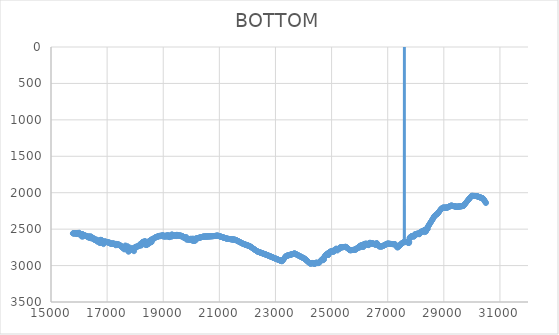
| Category | BOTTOM |
|---|---|
| 15780.464 | 2557.96 |
| 15787.5977 | 2557.96 |
| 15797.8371 | 2557.96 |
| 15808.0771 | 2557.96 |
| 15818.3171 | 2557.96 |
| 15828.5571 | 2557.96 |
| 15838.7971 | 2557.96 |
| 15849.0371 | 2557.96 |
| 15859.2771 | 2557.96 |
| 15869.5171 | 2557.96 |
| 15879.7571 | 2557.96 |
| 15889.9971 | 2557.96 |
| 15900.2371 | 2557.96 |
| 15910.477 | 2557.96 |
| 15920.717 | 2567.81 |
| 15930.957 | 2563.59 |
| 15941.197 | 2555.14 |
| 15951.437 | 2552.32 |
| 15961.677 | 2552.32 |
| 15971.917 | 2566.4 |
| 15982.157 | 2567.81 |
| 15992.397 | 2567.81 |
| 16002.637 | 2549.51 |
| 16012.877 | 2569.22 |
| 16023.117 | 2560.77 |
| 16033.357 | 2563.59 |
| 16043.597 | 2563.59 |
| 16053.8369 | 2566.4 |
| 16064.0769 | 2566.4 |
| 16074.3169 | 2567.81 |
| 16084.5569 | 2598.78 |
| 16094.7969 | 2566.4 |
| 16105.0369 | 2567.81 |
| 16115.2769 | 2567.81 |
| 16125.5169 | 2604.41 |
| 16135.7569 | 2573.44 |
| 16145.9969 | 2581.88 |
| 16156.2369 | 2577.66 |
| 16166.4769 | 2579.07 |
| 16176.7169 | 2591.74 |
| 16186.9569 | 2593.15 |
| 16197.1968 | 2583.29 |
| 16207.4368 | 2587.52 |
| 16217.6768 | 2587.52 |
| 16227.9168 | 2594.55 |
| 16238.1568 | 2590.33 |
| 16248.3968 | 2593.15 |
| 16258.6368 | 2595.96 |
| 16268.8768 | 2595.96 |
| 16279.1168 | 2595.96 |
| 16289.3568 | 2601.59 |
| 16299.5968 | 2601.59 |
| 16309.8368 | 2605.81 |
| 16320.0768 | 2608.63 |
| 16330.3168 | 2597.37 |
| 16340.5567 | 2614.26 |
| 16350.7967 | 2615.67 |
| 16361.0367 | 2618.48 |
| 16371.2767 | 2601.59 |
| 16381.5167 | 2603 |
| 16391.7567 | 2604.41 |
| 16401.9967 | 2601.59 |
| 16412.2367 | 2624.11 |
| 16422.4767 | 2603 |
| 16432.7167 | 2624.11 |
| 16442.9567 | 2605.81 |
| 16453.1967 | 2612.85 |
| 16463.4367 | 2629.74 |
| 16473.6766 | 2617.08 |
| 16483.9166 | 2619.89 |
| 16494.1566 | 2621.3 |
| 16504.3966 | 2622.71 |
| 16514.6366 | 2636.78 |
| 16524.8766 | 2639.6 |
| 16535.1166 | 2641 |
| 16545.3566 | 2645.23 |
| 16555.5966 | 2632.56 |
| 16565.8366 | 2646.63 |
| 16576.0766 | 2638.19 |
| 16586.3166 | 2652.27 |
| 16596.5566 | 2652.27 |
| 16606.7966 | 2649.45 |
| 16617.0365 | 2650.86 |
| 16627.2765 | 2643.82 |
| 16637.5165 | 2657.9 |
| 16647.7565 | 2667.75 |
| 16657.9965 | 2671.97 |
| 16668.2365 | 2656.49 |
| 16678.4765 | 2656.49 |
| 16688.7165 | 2656.49 |
| 16698.9565 | 2666.34 |
| 16709.1965 | 2667.75 |
| 16719.4365 | 2666.34 |
| 16729.6765 | 2666.34 |
| 16739.9165 | 2690.27 |
| 16750.1564 | 2690.27 |
| 16760.3964 | 2646.63 |
| 16770.6364 | 2648.04 |
| 16780.8764 | 2648.04 |
| 16791.1164 | 2652.27 |
| 16801.3564 | 2648.04 |
| 16811.5964 | 2673.38 |
| 16821.8364 | 2684.64 |
| 16832.0764 | 2673.38 |
| 16842.3164 | 2680.42 |
| 16852.5564 | 2687.46 |
| 16862.7964 | 2673.38 |
| 16873.0364 | 2705.75 |
| 16883.2764 | 2687.46 |
| 16893.5163 | 2670.56 |
| 16903.7563 | 2670.56 |
| 16913.9963 | 2667.75 |
| 16924.2363 | 2670.56 |
| 16934.4763 | 2674.79 |
| 16944.7163 | 2673.38 |
| 16954.9563 | 2676.19 |
| 16965.1963 | 2670.56 |
| 16975.4363 | 2676.19 |
| 16985.6763 | 2676.19 |
| 16995.9163 | 2677.6 |
| 17006.1563 | 2680.42 |
| 17016.3963 | 2679.01 |
| 17026.6362 | 2681.83 |
| 17036.8762 | 2681.83 |
| 17047.1162 | 2683.23 |
| 17057.3562 | 2684.64 |
| 17067.5962 | 2687.46 |
| 17077.8362 | 2686.05 |
| 17088.0762 | 2684.64 |
| 17098.3162 | 2688.86 |
| 17108.5562 | 2697.31 |
| 17118.7962 | 2697.31 |
| 17129.0362 | 2697.31 |
| 17139.2762 | 2697.31 |
| 17149.5162 | 2698.72 |
| 17159.7561 | 2700.12 |
| 17169.9961 | 2700.12 |
| 17180.2361 | 2701.53 |
| 17190.4761 | 2695.9 |
| 17200.7161 | 2697.31 |
| 17210.9561 | 2698.72 |
| 17221.1961 | 2700.12 |
| 17231.4361 | 2695.9 |
| 17241.6761 | 2701.53 |
| 17251.9161 | 2700.12 |
| 17262.1561 | 2705.75 |
| 17272.3961 | 2708.57 |
| 17282.6361 | 2702.94 |
| 17292.876 | 2704.35 |
| 17303.116 | 2721.24 |
| 17313.356 | 2701.53 |
| 17323.596 | 2709.98 |
| 17333.836 | 2707.16 |
| 17344.076 | 2714.2 |
| 17354.316 | 2707.16 |
| 17364.556 | 2718.42 |
| 17374.796 | 2708.57 |
| 17385.036 | 2709.98 |
| 17395.276 | 2709.98 |
| 17405.516 | 2709.98 |
| 17415.756 | 2714.2 |
| 17425.9959 | 2714.2 |
| 17436.2359 | 2718.42 |
| 17446.4759 | 2722.65 |
| 17456.7159 | 2722.65 |
| 17466.9559 | 2725.46 |
| 17477.1959 | 2728.28 |
| 17487.4359 | 2724.05 |
| 17497.6759 | 2736.72 |
| 17507.9159 | 2736.72 |
| 17518.1559 | 2742.35 |
| 17528.3959 | 2742.35 |
| 17538.6359 | 2749.39 |
| 17548.8758 | 2753.61 |
| 17559.1158 | 2753.61 |
| 17569.3558 | 2759.24 |
| 17579.5958 | 2759.24 |
| 17589.8358 | 2760.65 |
| 17600.0758 | 2769.1 |
| 17610.3158 | 2777.54 |
| 17620.5558 | 2739.54 |
| 17630.7958 | 2773.32 |
| 17641.0358 | 2747.98 |
| 17651.2758 | 2724.05 |
| 17661.5158 | 2739.54 |
| 17671.7558 | 2752.21 |
| 17681.9957 | 2753.61 |
| 17692.2357 | 2755.02 |
| 17702.4757 | 2756.43 |
| 17712.7157 | 2757.84 |
| 17722.9557 | 2736.72 |
| 17733.1957 | 2736.72 |
| 17743.4357 | 2759.24 |
| 17753.6757 | 2807.1 |
| 17763.9157 | 2805.7 |
| 17774.1557 | 2804.29 |
| 17784.3957 | 2766.28 |
| 17794.6357 | 2767.69 |
| 17804.8757 | 2794.43 |
| 17815.1156 | 2773.32 |
| 17825.3556 | 2753.61 |
| 17835.5956 | 2785.99 |
| 17845.8356 | 2784.58 |
| 17856.0756 | 2774.73 |
| 17866.3156 | 2776.14 |
| 17876.5556 | 2773.32 |
| 17886.7956 | 2777.54 |
| 17897.0356 | 2777.54 |
| 17907.2756 | 2770.51 |
| 17917.5156 | 2769.1 |
| 17927.7556 | 2759.24 |
| 17937.9955 | 2790.21 |
| 17948.2355 | 2764.87 |
| 17958.4755 | 2802.88 |
| 17968.7155 | 2762.06 |
| 17978.9555 | 2756.43 |
| 17989.1955 | 2750.8 |
| 17999.4355 | 2746.58 |
| 18009.6755 | 2742.35 |
| 18019.9155 | 2743.76 |
| 18030.1555 | 2742.35 |
| 18040.3955 | 2750.8 |
| 18050.6355 | 2745.17 |
| 18060.8754 | 2740.95 |
| 18071.1154 | 2738.13 |
| 18081.3554 | 2736.72 |
| 18091.5954 | 2735.31 |
| 18101.8354 | 2735.31 |
| 18112.0754 | 2732.5 |
| 18122.3154 | 2731.09 |
| 18132.5554 | 2731.09 |
| 18142.7954 | 2728.28 |
| 18153.0354 | 2728.28 |
| 18163.2754 | 2709.98 |
| 18173.5154 | 2708.57 |
| 18183.7553 | 2707.16 |
| 18193.9953 | 2704.35 |
| 18204.2353 | 2702.94 |
| 18214.4753 | 2722.65 |
| 18224.7153 | 2722.65 |
| 18234.9553 | 2697.31 |
| 18245.1953 | 2694.49 |
| 18255.4353 | 2694.49 |
| 18265.6753 | 2674.79 |
| 18275.9153 | 2674.79 |
| 18286.1553 | 2687.46 |
| 18296.3953 | 2686.05 |
| 18306.6353 | 2684.64 |
| 18316.8752 | 2673.38 |
| 18327.1152 | 2667.75 |
| 18337.3552 | 2667.75 |
| 18347.5952 | 2670.56 |
| 18357.8352 | 2666.34 |
| 18368.0752 | 2671.97 |
| 18378.3152 | 2718.42 |
| 18388.5552 | 2715.61 |
| 18398.7952 | 2715.61 |
| 18409.0352 | 2712.79 |
| 18419.2752 | 2712.79 |
| 18429.5152 | 2711.39 |
| 18439.7551 | 2707.16 |
| 18449.9951 | 2707.16 |
| 18460.2351 | 2671.97 |
| 18470.4751 | 2704.35 |
| 18480.7151 | 2676.19 |
| 18490.9551 | 2666.34 |
| 18501.1951 | 2686.05 |
| 18511.4351 | 2662.12 |
| 18521.6751 | 2680.42 |
| 18531.9151 | 2681.83 |
| 18542.1551 | 2652.27 |
| 18552.3951 | 2667.75 |
| 18562.635 | 2645.23 |
| 18572.875 | 2679.01 |
| 18583.115 | 2679.01 |
| 18593.355 | 2641 |
| 18603.595 | 2636.78 |
| 18613.835 | 2648.04 |
| 18624.075 | 2645.23 |
| 18634.315 | 2645.23 |
| 18644.555 | 2631.15 |
| 18654.795 | 2628.34 |
| 18665.035 | 2629.74 |
| 18675.2749 | 2625.52 |
| 18685.5149 | 2625.52 |
| 18695.7549 | 2619.89 |
| 18705.9949 | 2615.67 |
| 18716.2349 | 2615.67 |
| 18726.4749 | 2612.85 |
| 18736.7149 | 2611.44 |
| 18746.9549 | 2610.04 |
| 18757.1949 | 2608.63 |
| 18767.4349 | 2607.22 |
| 18777.6749 | 2604.41 |
| 18787.9149 | 2604.41 |
| 18798.1548 | 2600.18 |
| 18808.3948 | 2601.59 |
| 18818.6348 | 2598.78 |
| 18828.8748 | 2598.78 |
| 18839.1148 | 2597.37 |
| 18849.3548 | 2595.96 |
| 18859.5948 | 2591.74 |
| 18869.8348 | 2595.96 |
| 18880.0748 | 2591.74 |
| 18890.3148 | 2597.37 |
| 18900.5548 | 2591.74 |
| 18910.7948 | 2591.74 |
| 18921.0347 | 2590.33 |
| 18931.2747 | 2590.33 |
| 18941.5147 | 2591.74 |
| 18951.7547 | 2590.33 |
| 18961.9947 | 2591.74 |
| 18972.2347 | 2584.7 |
| 18982.4747 | 2584.7 |
| 18992.7147 | 2586.11 |
| 19002.9547 | 2603 |
| 19013.1947 | 2586.11 |
| 19023.4347 | 2600.18 |
| 19033.6746 | 2595.96 |
| 19043.9146 | 2593.15 |
| 19054.1546 | 2598.78 |
| 19064.3946 | 2598.78 |
| 19074.6346 | 2598.78 |
| 19084.8746 | 2603 |
| 19095.1146 | 2588.92 |
| 19105.3546 | 2588.92 |
| 19115.5946 | 2597.37 |
| 19125.8346 | 2587.52 |
| 19136.0746 | 2586.11 |
| 19146.3146 | 2600.18 |
| 19156.5545 | 2601.59 |
| 19166.7945 | 2584.7 |
| 19177.0345 | 2581.88 |
| 19187.2745 | 2593.15 |
| 19197.5145 | 2604.41 |
| 19207.7545 | 2604.41 |
| 19217.9945 | 2604.41 |
| 19228.2345 | 2610.04 |
| 19238.4745 | 2586.11 |
| 19248.7145 | 2597.37 |
| 19258.9545 | 2597.37 |
| 19269.1944 | 2591.74 |
| 19279.4344 | 2590.33 |
| 19289.6744 | 2605.81 |
| 19299.9144 | 2584.7 |
| 19310.1544 | 2570.62 |
| 19320.3944 | 2588.92 |
| 19330.6344 | 2593.15 |
| 19340.8744 | 2590.33 |
| 19351.1144 | 2590.33 |
| 19361.3544 | 2590.33 |
| 19371.5944 | 2587.52 |
| 19381.8344 | 2586.11 |
| 19392.0743 | 2586.11 |
| 19402.3143 | 2586.11 |
| 19412.5543 | 2587.52 |
| 19422.7943 | 2587.52 |
| 19433.0343 | 2588.92 |
| 19443.2743 | 2590.33 |
| 19453.5143 | 2590.33 |
| 19463.7543 | 2593.15 |
| 19473.9943 | 2594.55 |
| 19484.2343 | 2577.66 |
| 19494.4743 | 2580.48 |
| 19504.7142 | 2581.88 |
| 19514.9542 | 2583.29 |
| 19525.1942 | 2584.7 |
| 19535.4342 | 2587.52 |
| 19545.6742 | 2591.74 |
| 19555.9142 | 2588.92 |
| 19566.1542 | 2588.92 |
| 19576.3942 | 2584.7 |
| 19586.6342 | 2586.11 |
| 19596.8742 | 2588.92 |
| 19607.1142 | 2591.74 |
| 19617.3541 | 2588.92 |
| 19627.5941 | 2595.96 |
| 19637.8341 | 2588.92 |
| 19648.0741 | 2598.78 |
| 19658.3141 | 2591.74 |
| 19668.5541 | 2603 |
| 19678.7941 | 2595.96 |
| 19689.0341 | 2598.78 |
| 19699.2741 | 2603 |
| 19709.5141 | 2603 |
| 19719.7541 | 2614.26 |
| 19729.994 | 2607.22 |
| 19740.234 | 2617.08 |
| 19750.474 | 2619.89 |
| 19760.714 | 2614.26 |
| 19770.954 | 2624.11 |
| 19781.194 | 2615.67 |
| 19791.434 | 2615.67 |
| 19801.674 | 2615.67 |
| 19811.914 | 2624.11 |
| 19822.154 | 2608.63 |
| 19832.394 | 2643.82 |
| 19842.6339 | 2641 |
| 19852.8739 | 2639.6 |
| 19863.1139 | 2639.6 |
| 19873.3539 | 2638.19 |
| 19883.5939 | 2639.6 |
| 19893.8339 | 2638.19 |
| 19904.0739 | 2643.82 |
| 19914.3139 | 2643.82 |
| 19924.5539 | 2642.41 |
| 19934.7939 | 2642.41 |
| 19945.0339 | 2643.82 |
| 19955.2738 | 2645.23 |
| 19965.5138 | 2645.23 |
| 19975.7538 | 2631.15 |
| 19985.9938 | 2643.82 |
| 19996.2338 | 2649.45 |
| 20006.4738 | 2648.04 |
| 20016.7138 | 2645.23 |
| 20026.9538 | 2645.23 |
| 20037.1938 | 2653.67 |
| 20047.4338 | 2629.74 |
| 20057.6738 | 2662.12 |
| 20067.9137 | 2652.27 |
| 20078.1537 | 2633.97 |
| 20088.3937 | 2657.9 |
| 20098.6337 | 2657.9 |
| 20108.8737 | 2660.71 |
| 20119.1137 | 2662.12 |
| 20129.3537 | 2643.82 |
| 20139.5937 | 2645.23 |
| 20149.8337 | 2629.74 |
| 20160.0737 | 2653.67 |
| 20170.3137 | 2629.74 |
| 20180.5536 | 2628.67 |
| 20190.7936 | 2627.6 |
| 20201.0336 | 2626.53 |
| 20211.2736 | 2625.46 |
| 20221.5136 | 2624.39 |
| 20231.7536 | 2623.32 |
| 20241.9936 | 2622.26 |
| 20252.2336 | 2621.19 |
| 20262.4736 | 2620.12 |
| 20272.7136 | 2619.05 |
| 20282.9536 | 2617.98 |
| 20293.1935 | 2616.91 |
| 20303.4335 | 2615.84 |
| 20313.6735 | 2614.77 |
| 20323.9135 | 2613.7 |
| 20334.1535 | 2612.63 |
| 20344.3935 | 2611.56 |
| 20354.6335 | 2610.49 |
| 20364.8735 | 2609.42 |
| 20375.1135 | 2608.35 |
| 20385.3535 | 2607.28 |
| 20395.5935 | 2606.21 |
| 20405.8334 | 2605.14 |
| 20416.0734 | 2604.07 |
| 20426.3134 | 2603 |
| 20436.5534 | 2602.8 |
| 20446.7934 | 2602.6 |
| 20457.0334 | 2602.4 |
| 20467.2734 | 2602.19 |
| 20477.5134 | 2601.99 |
| 20487.7534 | 2601.79 |
| 20497.9934 | 2601.59 |
| 20508.2333 | 2601.39 |
| 20518.4733 | 2601.19 |
| 20528.7133 | 2600.99 |
| 20538.9533 | 2600.79 |
| 20549.1933 | 2600.59 |
| 20559.4333 | 2600.38 |
| 20569.6733 | 2600.18 |
| 20579.9133 | 2599.98 |
| 20590.1533 | 2599.78 |
| 20600.3933 | 2599.58 |
| 20610.6333 | 2599.38 |
| 20620.8732 | 2599.18 |
| 20631.1132 | 2598.98 |
| 20641.3532 | 2598.78 |
| 20651.5932 | 2598.57 |
| 20661.8332 | 2598.37 |
| 20672.0732 | 2598.17 |
| 20682.3132 | 2597.97 |
| 20692.5532 | 2597.77 |
| 20702.7932 | 2597.57 |
| 20713.0332 | 2597.37 |
| 20723.2732 | 2597.17 |
| 20733.5131 | 2596.97 |
| 20743.7531 | 2596.77 |
| 20753.9931 | 2596.56 |
| 20764.2331 | 2596.36 |
| 20774.4731 | 2596.16 |
| 20784.7131 | 2595.96 |
| 20794.9531 | 2595.49 |
| 20805.1931 | 2595.02 |
| 20815.4331 | 2594.55 |
| 20825.6731 | 2594.08 |
| 20835.913 | 2593.61 |
| 20846.153 | 2593.15 |
| 20856.393 | 2592.68 |
| 20866.633 | 2592.21 |
| 20876.873 | 2591.74 |
| 20887.113 | 2591.27 |
| 20897.353 | 2590.8 |
| 20907.593 | 2590.33 |
| 20917.833 | 2589.86 |
| 20928.073 | 2589.39 |
| 20938.3129 | 2588.92 |
| 20948.5529 | 2590.2 |
| 20958.7929 | 2591.48 |
| 20969.0329 | 2592.76 |
| 20979.2729 | 2594.04 |
| 20989.5129 | 2595.32 |
| 20999.7529 | 2596.6 |
| 21009.9929 | 2597.88 |
| 21020.2329 | 2599.16 |
| 21030.4729 | 2600.44 |
| 21040.7129 | 2601.72 |
| 21050.9528 | 2603 |
| 21061.1928 | 2604.28 |
| 21071.4328 | 2605.56 |
| 21081.6728 | 2606.84 |
| 21091.9128 | 2608.12 |
| 21102.1528 | 2609.4 |
| 21112.3928 | 2610.68 |
| 21122.6328 | 2611.96 |
| 21132.8728 | 2613.24 |
| 21143.1128 | 2614.52 |
| 21153.3527 | 2615.8 |
| 21163.5927 | 2617.08 |
| 21173.8327 | 2618.35 |
| 21184.0727 | 2619.63 |
| 21194.3127 | 2620.91 |
| 21204.5527 | 2622.19 |
| 21214.7927 | 2623.47 |
| 21225.0327 | 2624.75 |
| 21235.2727 | 2626.03 |
| 21245.5127 | 2627.31 |
| 21255.7526 | 2628.59 |
| 21265.9926 | 2629.87 |
| 21276.2326 | 2631.15 |
| 21286.4726 | 2631.69 |
| 21296.7126 | 2632.22 |
| 21306.9526 | 2632.75 |
| 21317.1926 | 2633.29 |
| 21327.4326 | 2633.82 |
| 21337.6726 | 2634.35 |
| 21347.9126 | 2634.89 |
| 21358.1526 | 2635.42 |
| 21368.3925 | 2635.96 |
| 21378.6325 | 2636.49 |
| 21388.8725 | 2637.02 |
| 21399.1125 | 2637.56 |
| 21409.3525 | 2638.09 |
| 21419.5925 | 2638.63 |
| 21429.8325 | 2639.16 |
| 21440.0725 | 2639.69 |
| 21450.3125 | 2640.23 |
| 21460.5525 | 2640.76 |
| 21470.7924 | 2641.3 |
| 21481.0324 | 2641.83 |
| 21491.2724 | 2642.36 |
| 21501.5124 | 2642.9 |
| 21511.7524 | 2643.43 |
| 21521.9924 | 2643.97 |
| 21532.2324 | 2644.5 |
| 21542.4724 | 2645.03 |
| 21552.7124 | 2645.57 |
| 21562.9524 | 2646.1 |
| 21573.1923 | 2646.63 |
| 21583.4323 | 2648.67 |
| 21593.6723 | 2650.7 |
| 21603.9123 | 2652.73 |
| 21614.1523 | 2654.77 |
| 21624.3923 | 2656.8 |
| 21634.6323 | 2658.83 |
| 21644.8723 | 2660.87 |
| 21655.1123 | 2662.9 |
| 21665.3523 | 2664.93 |
| 21675.5922 | 2666.97 |
| 21685.8322 | 2669 |
| 21696.0722 | 2671.03 |
| 21706.3122 | 2673.07 |
| 21716.5522 | 2675.1 |
| 21726.7922 | 2677.13 |
| 21737.0322 | 2679.17 |
| 21747.2722 | 2681.2 |
| 21757.5122 | 2683.23 |
| 21767.7522 | 2685.27 |
| 21777.9921 | 2687.3 |
| 21788.2321 | 2689.33 |
| 21798.4721 | 2691.37 |
| 21808.7121 | 2693.4 |
| 21818.9521 | 2695.43 |
| 21829.1921 | 2697.47 |
| 21839.4321 | 2699.5 |
| 21849.6721 | 2701.53 |
| 21859.9121 | 2702.94 |
| 21870.1521 | 2704.35 |
| 21880.392 | 2705.75 |
| 21890.632 | 2707.16 |
| 21900.872 | 2708.57 |
| 21911.112 | 2709.98 |
| 21921.352 | 2711.39 |
| 21931.592 | 2712.79 |
| 21941.832 | 2714.2 |
| 21952.072 | 2715.61 |
| 21962.312 | 2717.02 |
| 21972.5519 | 2718.42 |
| 21982.7919 | 2719.83 |
| 21993.0319 | 2721.24 |
| 22003.2719 | 2722.65 |
| 22013.5119 | 2724.05 |
| 22023.7519 | 2725.46 |
| 22033.9919 | 2726.87 |
| 22044.2319 | 2728.28 |
| 22054.4719 | 2729.68 |
| 22064.7119 | 2731.09 |
| 22074.9518 | 2732.5 |
| 22085.1918 | 2733.91 |
| 22095.4318 | 2736.67 |
| 22105.6718 | 2739.43 |
| 22115.9118 | 2742.19 |
| 22126.1518 | 2744.95 |
| 22136.3918 | 2747.71 |
| 22146.6318 | 2750.47 |
| 22156.8718 | 2753.23 |
| 22167.1118 | 2756 |
| 22177.3517 | 2758.76 |
| 22187.5917 | 2761.52 |
| 22197.8317 | 2764.28 |
| 22208.0717 | 2767.04 |
| 22218.3117 | 2769.8 |
| 22228.5517 | 2772.56 |
| 22238.7917 | 2775.32 |
| 22249.0317 | 2778.08 |
| 22259.2717 | 2780.85 |
| 22269.5117 | 2783.61 |
| 22279.7516 | 2786.37 |
| 22289.9916 | 2789.13 |
| 22300.2316 | 2791.89 |
| 22310.4716 | 2794.65 |
| 22320.7116 | 2797.41 |
| 22330.9516 | 2800.17 |
| 22341.1916 | 2802.93 |
| 22351.4316 | 2805.7 |
| 22361.6716 | 2807.15 |
| 22371.9115 | 2808.6 |
| 22382.1515 | 2810.05 |
| 22392.3915 | 2811.5 |
| 22402.6315 | 2812.95 |
| 22412.8715 | 2814.4 |
| 22423.1115 | 2815.85 |
| 22433.3515 | 2817.3 |
| 22443.5915 | 2818.75 |
| 22453.8315 | 2820.2 |
| 22464.0715 | 2821.65 |
| 22474.3114 | 2823.1 |
| 22484.5514 | 2824.55 |
| 22494.7914 | 2826 |
| 22505.0314 | 2827.45 |
| 22515.2714 | 2828.9 |
| 22525.5114 | 2830.35 |
| 22535.7514 | 2831.8 |
| 22545.9914 | 2833.25 |
| 22556.2314 | 2834.7 |
| 22566.4714 | 2836.15 |
| 22576.7113 | 2837.6 |
| 22586.9513 | 2839.05 |
| 22597.1913 | 2840.5 |
| 22607.4313 | 2841.95 |
| 22617.6713 | 2843.4 |
| 22627.9113 | 2844.85 |
| 22638.1513 | 2846.3 |
| 22648.3913 | 2847.75 |
| 22658.6313 | 2849.2 |
| 22668.8712 | 2850.65 |
| 22679.1112 | 2852.1 |
| 22689.3512 | 2853.55 |
| 22699.5912 | 2855.2 |
| 22709.8312 | 2856.85 |
| 22720.0712 | 2858.49 |
| 22730.3112 | 2860.14 |
| 22740.5512 | 2861.79 |
| 22750.7912 | 2863.43 |
| 22761.0312 | 2865.08 |
| 22771.2711 | 2866.73 |
| 22781.5111 | 2868.37 |
| 22791.7511 | 2870.02 |
| 22801.9911 | 2871.67 |
| 22812.2311 | 2873.31 |
| 22822.4711 | 2874.96 |
| 22832.7111 | 2876.61 |
| 22842.9511 | 2878.25 |
| 22853.1911 | 2879.9 |
| 22863.431 | 2881.55 |
| 22873.671 | 2883.19 |
| 22883.911 | 2884.84 |
| 22894.151 | 2886.49 |
| 22904.391 | 2888.13 |
| 22914.631 | 2889.78 |
| 22924.871 | 2891.43 |
| 22935.111 | 2893.07 |
| 22945.351 | 2894.72 |
| 22955.5909 | 2896.37 |
| 22965.8309 | 2898.01 |
| 22976.0709 | 2899.66 |
| 22986.3109 | 2901.31 |
| 22996.5509 | 2902.95 |
| 23006.7909 | 2904.6 |
| 23017.0309 | 2906.25 |
| 23027.2709 | 2907.89 |
| 23037.5109 | 2909.54 |
| 23047.7509 | 2911.19 |
| 23057.9908 | 2912.83 |
| 23068.2308 | 2914.48 |
| 23078.4708 | 2916.13 |
| 23088.7108 | 2917.77 |
| 23098.9508 | 2919.42 |
| 23109.1908 | 2921.07 |
| 23119.4308 | 2922.71 |
| 23129.6708 | 2924.36 |
| 23139.9108 | 2926.01 |
| 23150.1507 | 2927.65 |
| 23160.3907 | 2929.3 |
| 23170.6307 | 2930.95 |
| 23180.8707 | 2932.59 |
| 23191.1107 | 2934.24 |
| 23201.3507 | 2935.89 |
| 23211.5907 | 2937.53 |
| 23221.8307 | 2939.18 |
| 23232.0707 | 2940.83 |
| 23242.3106 | 2935.7 |
| 23252.5506 | 2930.57 |
| 23262.7906 | 2925.44 |
| 23273.0306 | 2920.32 |
| 23283.2706 | 2915.19 |
| 23293.5106 | 2910.06 |
| 23303.7506 | 2904.93 |
| 23313.9906 | 2899.8 |
| 23324.2306 | 2894.68 |
| 23334.4706 | 2889.55 |
| 23344.7105 | 2884.42 |
| 23354.9505 | 2879.29 |
| 23365.1905 | 2874.17 |
| 23375.4305 | 2869.04 |
| 23385.6705 | 2867.87 |
| 23395.9105 | 2866.69 |
| 23406.1505 | 2865.52 |
| 23416.3905 | 2864.35 |
| 23426.6305 | 2863.17 |
| 23436.8704 | 2862 |
| 23447.1104 | 2860.83 |
| 23457.3504 | 2859.65 |
| 23467.5904 | 2858.48 |
| 23477.8304 | 2857.31 |
| 23488.0704 | 2856.14 |
| 23498.3104 | 2854.96 |
| 23508.5504 | 2853.79 |
| 23518.7904 | 2852.62 |
| 23529.0303 | 2851.44 |
| 23539.2703 | 2850.27 |
| 23549.5103 | 2849.1 |
| 23559.7503 | 2847.92 |
| 23569.9903 | 2846.75 |
| 23580.2303 | 2845.58 |
| 23590.4703 | 2844.4 |
| 23600.7103 | 2843.23 |
| 23610.9503 | 2842.06 |
| 23621.1902 | 2840.89 |
| 23631.4302 | 2839.71 |
| 23641.6702 | 2838.54 |
| 23651.9102 | 2837.37 |
| 23662.1502 | 2836.19 |
| 23672.3902 | 2835.02 |
| 23682.6302 | 2833.85 |
| 23692.8702 | 2835.9 |
| 23703.1102 | 2837.95 |
| 23713.3501 | 2840 |
| 23723.5901 | 2842.05 |
| 23733.8301 | 2844.1 |
| 23744.0701 | 2846.15 |
| 23754.3101 | 2848.21 |
| 23764.5501 | 2850.26 |
| 23774.7901 | 2852.31 |
| 23785.0301 | 2854.36 |
| 23795.2701 | 2856.41 |
| 23805.51 | 2858.46 |
| 23815.75 | 2860.51 |
| 23825.99 | 2862.56 |
| 23836.23 | 2864.61 |
| 23846.47 | 2866.67 |
| 23856.71 | 2868.72 |
| 23866.95 | 2870.77 |
| 23877.19 | 2872.82 |
| 23887.43 | 2874.87 |
| 23897.6699 | 2876.92 |
| 23907.9099 | 2878.97 |
| 23918.1499 | 2881.02 |
| 23928.3899 | 2883.07 |
| 23938.6299 | 2885.13 |
| 23948.8699 | 2887.18 |
| 23959.1099 | 2889.23 |
| 23969.3499 | 2891.28 |
| 23979.5899 | 2893.33 |
| 23989.8298 | 2895.38 |
| 24000.0698 | 2897.43 |
| 24010.3098 | 2899.48 |
| 24020.5498 | 2901.53 |
| 24030.7898 | 2903.59 |
| 24041.0298 | 2905.64 |
| 24051.2698 | 2909.23 |
| 24061.5098 | 2912.83 |
| 24071.7498 | 2916.43 |
| 24081.9897 | 2920.03 |
| 24092.2297 | 2923.62 |
| 24102.4697 | 2927.22 |
| 24112.7097 | 2930.82 |
| 24122.9497 | 2934.41 |
| 24133.1897 | 2938.01 |
| 24143.4297 | 2941.61 |
| 24153.6697 | 2945.21 |
| 24163.9097 | 2948.8 |
| 24174.1496 | 2952.4 |
| 24184.3896 | 2956 |
| 24194.6296 | 2959.59 |
| 24204.8696 | 2963.19 |
| 24215.1096 | 2966.79 |
| 24225.3496 | 2970.39 |
| 24235.5896 | 2971.79 |
| 24245.8296 | 2971.79 |
| 24256.0696 | 2968.98 |
| 24266.3095 | 2971.79 |
| 24276.5495 | 2967.57 |
| 24286.7895 | 2968.98 |
| 24297.0295 | 2970.39 |
| 24307.2695 | 2963.35 |
| 24317.5095 | 2967.57 |
| 24327.7495 | 2966.16 |
| 24337.9895 | 2967.57 |
| 24348.2294 | 2967.57 |
| 24358.4694 | 2967.57 |
| 24368.7094 | 2968.98 |
| 24378.9494 | 2977.42 |
| 24389.1894 | 2970.39 |
| 24399.4294 | 2971.79 |
| 24409.6694 | 2971.79 |
| 24419.9094 | 2973.2 |
| 24430.1494 | 2967.57 |
| 24440.3893 | 2960.53 |
| 24450.6293 | 2960.53 |
| 24460.8693 | 2961.94 |
| 24471.1093 | 2963.35 |
| 24481.3493 | 2961.94 |
| 24491.5893 | 2961.94 |
| 24501.8293 | 2963.35 |
| 24512.0693 | 2967.57 |
| 24522.3093 | 2964.76 |
| 24532.5492 | 2964.76 |
| 24542.7892 | 2961.94 |
| 24553.0292 | 2963.35 |
| 24563.2692 | 2952.09 |
| 24573.5092 | 2947.86 |
| 24583.7492 | 2946.46 |
| 24593.9892 | 2943.64 |
| 24604.2292 | 2942.23 |
| 24614.4692 | 2930.97 |
| 24624.7091 | 2926.75 |
| 24634.9491 | 2926.75 |
| 24645.1891 | 2919.71 |
| 24655.4291 | 2916.9 |
| 24665.6691 | 2916.9 |
| 24675.9091 | 2911.27 |
| 24686.1491 | 2925.34 |
| 24696.3891 | 2898.6 |
| 24706.629 | 2898.6 |
| 24716.869 | 2921.12 |
| 24727.109 | 2918.3 |
| 24737.349 | 2884.52 |
| 24747.589 | 2881.71 |
| 24757.829 | 2877.48 |
| 24768.069 | 2864.82 |
| 24778.309 | 2862 |
| 24788.549 | 2857.78 |
| 24798.7889 | 2854.96 |
| 24809.0289 | 2852.15 |
| 24819.2689 | 2846.52 |
| 24829.5089 | 2845.11 |
| 24839.7489 | 2842.29 |
| 24849.9889 | 2838.07 |
| 24860.2289 | 2831.03 |
| 24870.4689 | 2853.55 |
| 24880.7089 | 2853.55 |
| 24890.9488 | 2853.55 |
| 24901.1888 | 2825.4 |
| 24911.4288 | 2823.99 |
| 24921.6688 | 2821.18 |
| 24931.9088 | 2816.96 |
| 24942.1488 | 2811.33 |
| 24952.3888 | 2809.92 |
| 24962.6288 | 2807.1 |
| 24972.8687 | 2807.1 |
| 24983.1087 | 2807.1 |
| 24993.3487 | 2805.7 |
| 25003.5887 | 2805.7 |
| 25013.8287 | 2805.7 |
| 25024.0687 | 2802.88 |
| 25034.3087 | 2807.1 |
| 25044.5487 | 2807.1 |
| 25054.7887 | 2807.1 |
| 25065.0286 | 2808.51 |
| 25075.2686 | 2807.1 |
| 25085.5086 | 2807.1 |
| 25095.7486 | 2784.58 |
| 25105.9886 | 2784.58 |
| 25116.2286 | 2785.99 |
| 25126.4686 | 2785.99 |
| 25136.7086 | 2785.99 |
| 25146.9485 | 2777.54 |
| 25157.1885 | 2774.73 |
| 25167.4285 | 2766.28 |
| 25177.6685 | 2774.73 |
| 25187.9085 | 2773.32 |
| 25198.1485 | 2773.32 |
| 25208.3885 | 2793.03 |
| 25218.6285 | 2773.32 |
| 25228.8685 | 2773.32 |
| 25239.1084 | 2773.32 |
| 25249.3484 | 2771.91 |
| 25259.5884 | 2773.32 |
| 25269.8284 | 2774.73 |
| 25280.0684 | 2763.47 |
| 25290.3084 | 2755.02 |
| 25300.5484 | 2752.21 |
| 25310.7884 | 2751.71 |
| 25321.0283 | 2751.22 |
| 25331.2683 | 2750.73 |
| 25341.5083 | 2750.24 |
| 25351.7483 | 2749.74 |
| 25361.9883 | 2749.25 |
| 25372.2283 | 2748.76 |
| 25382.4683 | 2748.26 |
| 25392.7083 | 2747.77 |
| 25402.9482 | 2747.28 |
| 25413.1882 | 2746.79 |
| 25423.4282 | 2746.29 |
| 25433.6682 | 2745.8 |
| 25443.9082 | 2745.31 |
| 25454.1482 | 2744.82 |
| 25464.3882 | 2744.32 |
| 25474.6282 | 2743.83 |
| 25484.8682 | 2743.34 |
| 25495.1081 | 2742.85 |
| 25505.3481 | 2742.35 |
| 25515.5881 | 2745.54 |
| 25525.8281 | 2748.73 |
| 25536.0681 | 2751.92 |
| 25546.3081 | 2755.12 |
| 25556.5481 | 2758.31 |
| 25566.7881 | 2761.5 |
| 25577.028 | 2764.69 |
| 25587.268 | 2767.88 |
| 25597.508 | 2771.07 |
| 25607.748 | 2774.26 |
| 25617.988 | 2777.45 |
| 25628.228 | 2780.64 |
| 25638.468 | 2783.83 |
| 25648.708 | 2787.02 |
| 25658.9479 | 2790.21 |
| 25669.1879 | 2789.72 |
| 25679.4279 | 2789.23 |
| 25689.6679 | 2788.73 |
| 25699.9079 | 2788.24 |
| 25710.1479 | 2787.75 |
| 25720.3879 | 2787.26 |
| 25730.6279 | 2786.76 |
| 25740.8679 | 2786.27 |
| 25751.1078 | 2785.78 |
| 25761.3478 | 2785.29 |
| 25771.5878 | 2784.79 |
| 25781.8278 | 2784.3 |
| 25792.0678 | 2783.81 |
| 25802.3078 | 2783.31 |
| 25812.5478 | 2782.82 |
| 25822.7878 | 2782.33 |
| 25833.0277 | 2781.84 |
| 25843.2677 | 2781.34 |
| 25853.5077 | 2780.85 |
| 25863.7477 | 2780.36 |
| 25873.9877 | 2766.28 |
| 25884.2277 | 2771.91 |
| 25894.4677 | 2771.91 |
| 25904.7077 | 2766.28 |
| 25914.9476 | 2757.84 |
| 25925.1876 | 2757.84 |
| 25935.4276 | 2757.84 |
| 25945.6676 | 2757.84 |
| 25955.9076 | 2747.98 |
| 25966.1476 | 2746.58 |
| 25976.3876 | 2745.17 |
| 25986.6276 | 2755.02 |
| 25996.8675 | 2732.5 |
| 26007.1075 | 2736.72 |
| 26017.3475 | 2731.09 |
| 26027.5875 | 2725.46 |
| 26037.8275 | 2745.17 |
| 26048.0675 | 2722.65 |
| 26058.3075 | 2728.28 |
| 26068.5475 | 2721.24 |
| 26078.7874 | 2719.83 |
| 26089.0274 | 2740.95 |
| 26099.2674 | 2740.95 |
| 26109.5074 | 2740.95 |
| 26119.7474 | 2712.79 |
| 26129.9874 | 2742.35 |
| 26140.2274 | 2742.35 |
| 26150.4674 | 2707.16 |
| 26160.7073 | 2707.16 |
| 26170.9473 | 2704.35 |
| 26181.1873 | 2704.35 |
| 26191.4273 | 2704.35 |
| 26201.6673 | 2698.72 |
| 26211.9073 | 2701.53 |
| 26222.1473 | 2700.12 |
| 26232.3873 | 2717.02 |
| 26242.6273 | 2708.57 |
| 26252.8672 | 2700.12 |
| 26263.1072 | 2700.12 |
| 26273.3472 | 2705.75 |
| 26283.5872 | 2705.75 |
| 26293.8272 | 2709.98 |
| 26304.0672 | 2709.98 |
| 26314.3072 | 2715.61 |
| 26324.5472 | 2719.83 |
| 26334.7871 | 2697.31 |
| 26345.0271 | 2693.09 |
| 26355.2671 | 2694.49 |
| 26365.5071 | 2686.05 |
| 26375.7471 | 2701.53 |
| 26385.9871 | 2698.72 |
| 26396.2271 | 2698.72 |
| 26406.4671 | 2690.27 |
| 26416.707 | 2694.49 |
| 26426.947 | 2691.68 |
| 26437.187 | 2695.9 |
| 26447.427 | 2693.09 |
| 26457.667 | 2697.31 |
| 26467.907 | 2695.9 |
| 26478.147 | 2701.53 |
| 26488.387 | 2698.72 |
| 26498.6269 | 2700.12 |
| 26508.8669 | 2701.53 |
| 26519.1069 | 2701.53 |
| 26529.3469 | 2705.75 |
| 26539.5869 | 2708.57 |
| 26549.8269 | 2714.2 |
| 26560.0669 | 2709.98 |
| 26570.3069 | 2709.98 |
| 26580.5468 | 2708.57 |
| 26590.7868 | 2709.98 |
| 26601.0268 | 2691.68 |
| 26611.2668 | 2693.09 |
| 26621.5068 | 2695.9 |
| 26631.7468 | 2719.83 |
| 26641.9868 | 2712.79 |
| 26652.2268 | 2715.61 |
| 26662.4667 | 2718.42 |
| 26672.7067 | 2719.83 |
| 26682.9467 | 2725.46 |
| 26693.1867 | 2736.72 |
| 26703.4267 | 2736.72 |
| 26713.6667 | 2736.72 |
| 26723.9067 | 2736.72 |
| 26734.1467 | 2736.72 |
| 26744.3866 | 2736.72 |
| 26754.6266 | 2736.72 |
| 26764.8666 | 2736.72 |
| 26775.1066 | 2736.72 |
| 26785.3466 | 2736.72 |
| 26795.5866 | 2736.72 |
| 26805.8266 | 2734.72 |
| 26816.0665 | 2732.72 |
| 26826.3065 | 2730.72 |
| 26836.5465 | 2728.72 |
| 26846.7865 | 2726.72 |
| 26857.0265 | 2724.72 |
| 26867.2665 | 2722.72 |
| 26877.5065 | 2720.72 |
| 26887.7465 | 2718.72 |
| 26897.9864 | 2716.72 |
| 26908.2264 | 2714.72 |
| 26918.4664 | 2712.72 |
| 26928.7064 | 2710.72 |
| 26938.9464 | 2708.72 |
| 26949.1864 | 2706.72 |
| 26959.4264 | 2704.72 |
| 26969.6664 | 2702.72 |
| 26979.9063 | 2700.72 |
| 26990.1463 | 2698.72 |
| 27000.3863 | 2699.08 |
| 27010.6263 | 2699.45 |
| 27020.8663 | 2699.81 |
| 27031.1063 | 2700.18 |
| 27041.3463 | 2700.54 |
| 27051.5863 | 2700.91 |
| 27061.8262 | 2701.27 |
| 27072.0662 | 2701.64 |
| 27082.3062 | 2702 |
| 27092.5462 | 2702.37 |
| 27102.7862 | 2702.73 |
| 27113.0262 | 2703.1 |
| 27123.2662 | 2703.46 |
| 27133.5062 | 2703.83 |
| 27143.7461 | 2704.19 |
| 27153.9861 | 2704.56 |
| 27164.2261 | 2704.92 |
| 27174.4661 | 2705.29 |
| 27184.7061 | 2705.65 |
| 27194.9461 | 2706.02 |
| 27205.1861 | 2706.38 |
| 27215.4261 | 2706.75 |
| 27225.666 | 2707.11 |
| 27235.906 | 2707.48 |
| 27246.146 | 2707.84 |
| 27256.386 | 2708.21 |
| 27266.626 | 2708.57 |
| 27276.866 | 2714.02 |
| 27287.106 | 2719.48 |
| 27297.3459 | 2724.93 |
| 27307.5859 | 2730.39 |
| 27317.8259 | 2735.84 |
| 27328.0659 | 2741.3 |
| 27338.3059 | 2746.75 |
| 27348.5459 | 2752.21 |
| 27358.7859 | 2748.42 |
| 27369.0259 | 2744.64 |
| 27379.2658 | 2740.86 |
| 27389.5058 | 2737.07 |
| 27399.7458 | 2733.29 |
| 27409.9858 | 2729.51 |
| 27420.2258 | 2725.73 |
| 27430.4658 | 2721.94 |
| 27440.7058 | 2718.16 |
| 27450.9458 | 2714.38 |
| 27461.1857 | 2710.59 |
| 27471.4257 | 2706.81 |
| 27481.6657 | 2703.03 |
| 27491.9057 | 2699.24 |
| 27502.1457 | 2695.46 |
| 27512.3857 | 2691.68 |
| 27522.6257 | 2689.67 |
| 27532.8656 | 2687.66 |
| 27543.1056 | 2685.65 |
| 27553.3456 | 2683.64 |
| 27563.5856 | 2681.62 |
| 27573.8256 | 2679.61 |
| 27584.0656 | 2677.6 |
| 27594.3056 | -9999 |
| 27604.5456 | 2676.19 |
| 27614.7855 | 2676.19 |
| 27625.0255 | 2676.19 |
| 27635.2655 | 2677.6 |
| 27645.5055 | 2674.79 |
| 27655.7455 | 2676.19 |
| 27665.9855 | 2676.19 |
| 27676.2255 | 2677.6 |
| 27686.4655 | 2674.79 |
| 27696.7054 | 2680.42 |
| 27706.9454 | 2680.42 |
| 27717.1854 | 2680.42 |
| 27727.4254 | 2683.23 |
| 27737.6654 | 2686.05 |
| 27747.9054 | 2686.05 |
| 27758.1454 | 2691.68 |
| 27768.3853 | 2674.79 |
| 27778.6253 | 2625.52 |
| 27788.8653 | 2614.26 |
| 27799.1053 | 2621.3 |
| 27809.3453 | 2605.81 |
| 27819.5853 | 2614.26 |
| 27829.8253 | 2601.59 |
| 27840.0653 | 2600.18 |
| 27850.3052 | 2598.78 |
| 27860.5452 | 2597.37 |
| 27870.7852 | 2595.96 |
| 27881.0252 | 2595.96 |
| 27891.2652 | 2595.96 |
| 27901.5052 | 2594.55 |
| 27911.7452 | 2603 |
| 27921.9851 | 2597.37 |
| 27932.2251 | 2600.18 |
| 27942.4651 | 2595.96 |
| 27952.7051 | 2597.37 |
| 27962.9451 | 2570.62 |
| 27973.1851 | 2573.44 |
| 27983.4251 | 2581.88 |
| 27993.6651 | 2574.85 |
| 28003.905 | 2569.22 |
| 28014.145 | 2569.22 |
| 28024.385 | 2564.99 |
| 28034.625 | 2563.59 |
| 28044.865 | 2563.59 |
| 28055.105 | 2569.22 |
| 28065.345 | 2562.18 |
| 28075.5849 | 2562.18 |
| 28085.8249 | 2563.59 |
| 28096.0649 | 2560.77 |
| 28106.3049 | 2556.55 |
| 28116.5449 | 2562.18 |
| 28126.7849 | 2570.62 |
| 28137.0249 | 2566.4 |
| 28147.2649 | 2545.29 |
| 28157.5048 | 2546.69 |
| 28167.7448 | 2543.88 |
| 28177.9848 | 2539.66 |
| 28188.2248 | 2536.84 |
| 28198.4648 | 2535.43 |
| 28208.7048 | 2531.21 |
| 28218.9448 | 2534.03 |
| 28229.1847 | 2528.4 |
| 28239.4247 | 2532.62 |
| 28249.6647 | 2534.03 |
| 28259.9047 | 2524.17 |
| 28270.1447 | 2528.4 |
| 28280.3847 | 2519.95 |
| 28290.6247 | 2519.95 |
| 28300.8647 | 2512.91 |
| 28311.1046 | 2541.06 |
| 28321.3446 | 2508.69 |
| 28331.5846 | 2505.87 |
| 28341.8246 | 2531.21 |
| 28352.0646 | 2531.21 |
| 28362.3046 | 2534.03 |
| 28372.5446 | 2507.28 |
| 28382.7845 | 2508.69 |
| 28393.0245 | 2497.43 |
| 28403.2645 | 2497.43 |
| 28413.5045 | 2500.24 |
| 28423.7445 | 2497.43 |
| 28433.9845 | 2466.46 |
| 28444.2245 | 2460.17 |
| 28454.4645 | 2453.87 |
| 28464.7044 | 2447.58 |
| 28474.9444 | 2441.29 |
| 28485.1844 | 2435 |
| 28495.4244 | 2428.7 |
| 28505.6644 | 2422.41 |
| 28515.9044 | 2416.12 |
| 28526.1444 | 2409.82 |
| 28536.3843 | 2403.53 |
| 28546.6243 | 2397.24 |
| 28556.8643 | 2390.95 |
| 28567.1043 | 2384.65 |
| 28577.3443 | 2378.36 |
| 28587.5843 | 2372.07 |
| 28597.8243 | 2365.77 |
| 28608.0642 | 2359.48 |
| 28618.3042 | 2352.68 |
| 28628.5442 | 2345.87 |
| 28638.7842 | 2339.07 |
| 28649.0242 | 2332.27 |
| 28659.2642 | 2325.46 |
| 28669.5042 | 2318.66 |
| 28679.7442 | 2315.72 |
| 28689.9841 | 2312.77 |
| 28700.2241 | 2309.83 |
| 28710.4641 | 2306.89 |
| 28720.7041 | 2303.94 |
| 28730.9441 | 2301 |
| 28741.1841 | 2298.06 |
| 28751.4241 | 2295.11 |
| 28761.664 | 2292.17 |
| 28771.904 | 2289.23 |
| 28782.144 | 2286.29 |
| 28792.384 | 2280.91 |
| 28802.624 | 2275.54 |
| 28812.864 | 2270.16 |
| 28823.104 | 2264.79 |
| 28833.3439 | 2259.41 |
| 28843.5839 | 2254.04 |
| 28853.8239 | 2248.66 |
| 28864.0639 | 2243.29 |
| 28874.3039 | 2237.91 |
| 28884.5439 | 2232.54 |
| 28894.7839 | 2227.17 |
| 28905.0238 | 2223.65 |
| 28915.2638 | 2220.13 |
| 28925.5038 | 2216.61 |
| 28935.7438 | 2213.09 |
| 28945.9838 | 2209.57 |
| 28956.2238 | 2206.05 |
| 28966.4638 | 2205.96 |
| 28976.7038 | 2205.88 |
| 28986.9437 | 2205.79 |
| 28997.1837 | 2205.7 |
| 29007.4237 | 2205.61 |
| 29017.6637 | 2205.52 |
| 29027.9037 | 2205.44 |
| 29038.1437 | 2205.35 |
| 29048.3837 | 2205.26 |
| 29058.6236 | 2205.17 |
| 29068.8636 | 2205.08 |
| 29079.1036 | 2205 |
| 29089.3436 | 2204.91 |
| 29099.5836 | 2204.82 |
| 29109.8236 | 2204.73 |
| 29120.0636 | 2204.64 |
| 29130.3035 | 2202.63 |
| 29140.5435 | 2200.62 |
| 29150.7835 | 2198.61 |
| 29161.0235 | 2196.6 |
| 29171.2635 | 2194.59 |
| 29181.5035 | 2192.58 |
| 29191.7435 | 2190.57 |
| 29201.9834 | 2188.56 |
| 29212.2234 | 2186.55 |
| 29222.4634 | 2184.53 |
| 29232.7034 | 2182.52 |
| 29242.9434 | 2180.51 |
| 29253.1834 | 2178.5 |
| 29263.4234 | 2176.49 |
| 29273.6634 | 2177.38 |
| 29283.9033 | 2178.27 |
| 29294.1433 | 2179.16 |
| 29304.3833 | 2180.05 |
| 29314.6233 | 2180.94 |
| 29324.8633 | 2181.83 |
| 29335.1033 | 2182.71 |
| 29345.3433 | 2183.6 |
| 29355.5832 | 2184.49 |
| 29365.8232 | 2185.38 |
| 29376.0632 | 2186.27 |
| 29386.3032 | 2187.16 |
| 29396.5432 | 2188.05 |
| 29406.7832 | 2188.94 |
| 29417.0232 | 2189.83 |
| 29427.2631 | 2190.72 |
| 29437.5031 | 2191.6 |
| 29447.7431 | 2192.49 |
| 29457.9831 | 2193.38 |
| 29468.2231 | 2192.89 |
| 29478.4631 | 2192.4 |
| 29488.7031 | 2191.91 |
| 29498.943 | 2191.42 |
| 29509.183 | 2190.93 |
| 29519.423 | 2190.44 |
| 29529.663 | 2189.96 |
| 29539.903 | 2189.47 |
| 29550.143 | 2188.98 |
| 29560.383 | 2188.49 |
| 29570.6229 | 2188 |
| 29580.8629 | 2187.51 |
| 29591.1029 | 2187.02 |
| 29601.3429 | 2186.53 |
| 29611.5829 | 2186.04 |
| 29621.8229 | 2185.55 |
| 29632.0629 | 2185.06 |
| 29642.3028 | 2184.57 |
| 29652.5428 | 2184.08 |
| 29662.7828 | 2183.59 |
| 29673.0228 | 2183.1 |
| 29683.2628 | 2182.61 |
| 29693.5028 | 2182.12 |
| 29703.7428 | 2177.32 |
| 29713.9827 | 2172.51 |
| 29724.2227 | 2167.71 |
| 29734.4627 | 2162.9 |
| 29744.7027 | 2158.1 |
| 29754.9427 | 2153.29 |
| 29765.1827 | 2148.48 |
| 29775.4227 | 2143.68 |
| 29785.6626 | 2138.87 |
| 29795.9026 | 2134.07 |
| 29806.1426 | 2129.26 |
| 29816.3826 | 2124.46 |
| 29826.6226 | 2119.65 |
| 29836.8626 | 2114.85 |
| 29847.1026 | 2110.04 |
| 29857.3425 | 2105.24 |
| 29867.5825 | 2100.43 |
| 29877.8225 | 2095.63 |
| 29888.0625 | 2090.82 |
| 29898.3025 | 2086.02 |
| 29908.5425 | 2081.21 |
| 29918.7825 | 2076.4 |
| 29929.0224 | 2071.6 |
| 29939.2624 | 2066.79 |
| 29949.5024 | 2061.99 |
| 29959.7424 | 2057.18 |
| 29969.9824 | 2052.38 |
| 29980.2224 | 2047.57 |
| 29990.4624 | 2042.77 |
| 30000.7023 | 2042.93 |
| 30010.9423 | 2043.1 |
| 30021.1823 | 2043.26 |
| 30031.4223 | 2043.43 |
| 30041.6623 | 2043.6 |
| 30051.9023 | 2043.76 |
| 30062.1423 | 2043.93 |
| 30072.3822 | 2044.09 |
| 30082.6222 | 2044.26 |
| 30092.8622 | 2044.42 |
| 30103.1022 | 2044.59 |
| 30113.3422 | 2044.75 |
| 30123.5822 | 2044.92 |
| 30133.8222 | 2045.09 |
| 30144.0621 | 2045.25 |
| 30154.3021 | 2045.42 |
| 30164.5421 | 2045.58 |
| 30174.7821 | 2047.05 |
| 30185.0221 | 2048.52 |
| 30195.2621 | 2049.99 |
| 30205.5021 | 2051.46 |
| 30215.742 | 2052.93 |
| 30225.982 | 2054.4 |
| 30236.222 | 2055.86 |
| 30246.462 | 2057.33 |
| 30256.702 | 2058.8 |
| 30266.942 | 2060.27 |
| 30277.182 | 2061.74 |
| 30287.4219 | 2063.21 |
| 30297.6619 | 2064.68 |
| 30307.9019 | 2066.15 |
| 30318.1419 | 2067.62 |
| 30328.3819 | 2069.08 |
| 30338.6219 | 2070.55 |
| 30348.8619 | 2072.02 |
| 30359.1018 | 2073.49 |
| 30369.3418 | 2074.96 |
| 30379.5818 | 2076.43 |
| 30389.8218 | 2077.9 |
| 30400.0618 | 2079.37 |
| 30410.3018 | 2085.56 |
| 30420.5418 | 2091.75 |
| 30430.7817 | 2097.95 |
| 30441.0217 | 2104.14 |
| 30451.2617 | 2110.33 |
| 30461.5017 | 2116.53 |
| 30471.7417 | 2122.72 |
| 30481.9817 | 2128.91 |
| 30492.2216 | 2135.11 |
| 30500.9802 | 2141.3 |